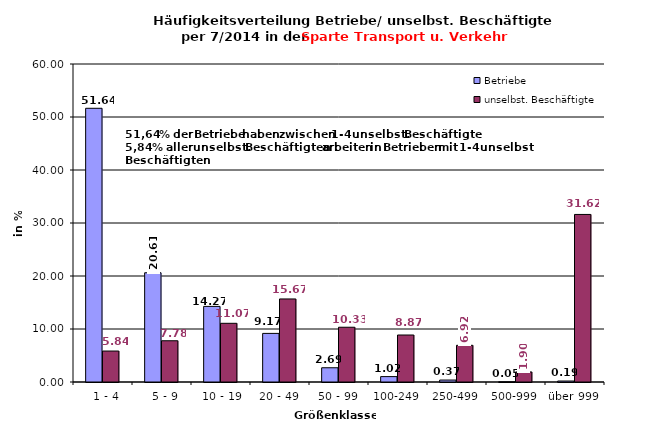
| Category | Betriebe | unselbst. Beschäftigte |
|---|---|---|
|   1 - 4 | 51.644 | 5.841 |
|   5 - 9 | 20.611 | 7.78 |
|  10 - 19 | 14.266 | 11.074 |
| 20 - 49 | 9.171 | 15.671 |
| 50 - 99 | 2.686 | 10.33 |
| 100-249 | 1.019 | 8.866 |
| 250-499 | 0.371 | 6.924 |
| 500-999 | 0.046 | 1.897 |
| über 999 | 0.185 | 31.615 |